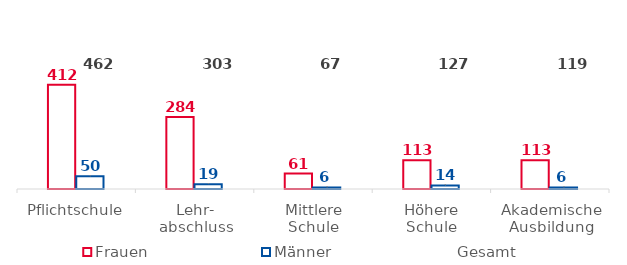
| Category | Frauen | Männer |
|---|---|---|
| Pflichtschule | 412 | 50 |
| Lehr-
abschluss | 284 | 19 |
| Mittlere
Schule | 61 | 6 |
| Höhere
Schule | 113 | 14 |
| Akademische
Ausbildung | 113 | 6 |